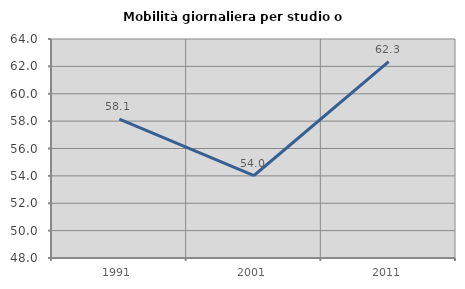
| Category | Mobilità giornaliera per studio o lavoro |
|---|---|
| 1991.0 | 58.145 |
| 2001.0 | 54.026 |
| 2011.0 | 62.346 |